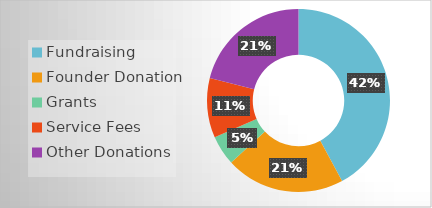
| Category | Series 0 |
|---|---|
| Fundraising | 0.421 |
| Founder Donation | 0.211 |
| Grants | 0.053 |
| Service Fees | 0.105 |
| Other Donations | 0.211 |